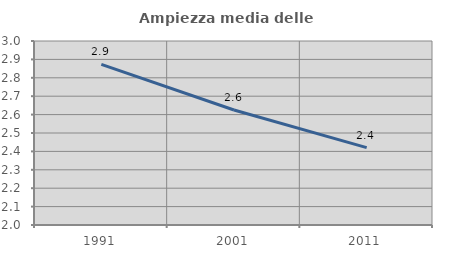
| Category | Ampiezza media delle famiglie |
|---|---|
| 1991.0 | 2.873 |
| 2001.0 | 2.625 |
| 2011.0 | 2.421 |